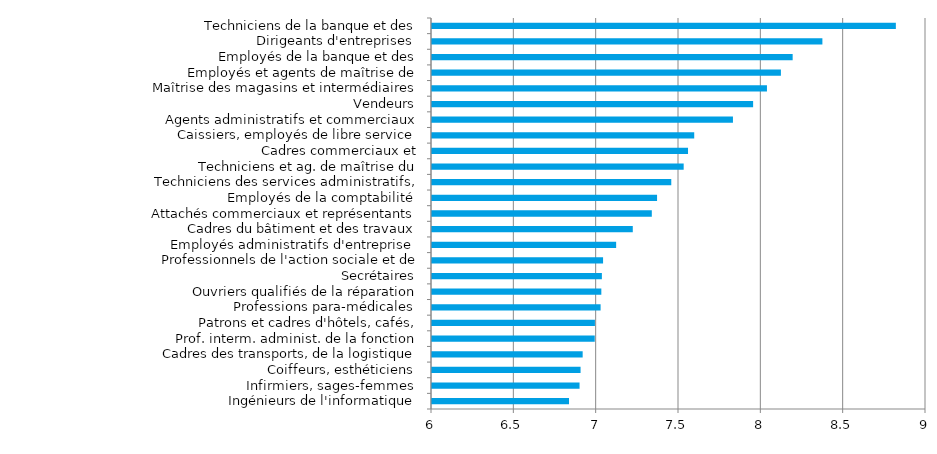
| Category | Series 0 |
|---|---|
| Ingénieurs de l'informatique | 6.832 |
| Infirmiers, sages-femmes | 6.896 |
| Coiffeurs, esthéticiens | 6.902 |
| Cadres des transports, de la logistique et navigants de l'aviation | 6.915 |
| Prof. interm. administ. de la fonction publique (catégorie B et assimilés) | 6.988 |
| Patrons et cadres d'hôtels, cafés, restaurants | 6.989 |
| Professions para-médicales | 7.024 |
| Ouvriers qualifiés de la réparation automobile | 7.028 |
| Secrétaires | 7.032 |
| Professionnels de l'action sociale et de l'orientation | 7.039 |
| Employés administratifs d'entreprise | 7.118 |
| Cadres du bâtiment et des travaux publics | 7.219 |
| Attachés commerciaux et représentants | 7.335 |
| Employés de la comptabilité | 7.367 |
| Techniciens des services administratifs, comptables et financiers | 7.453 |
| Techniciens et ag. de maîtrise du bâtiment et des travaux publics | 7.528 |
| Cadres commerciaux et technico-commerciaux | 7.555 |
| Caissiers, employés de libre service | 7.592 |
| Agents administratifs et commerciaux des transports et du tourisme | 7.828 |
| Vendeurs | 7.95 |
| Maîtrise des magasins et intermédiaires du commerce | 8.034 |
| Employés et agents de maîtrise de l'hôtellerie et de la restauration | 8.119 |
| Employés de la banque et des assurances | 8.19 |
| Dirigeants d'entreprises | 8.371 |
| Techniciens de la banque et des assurances | 8.817 |